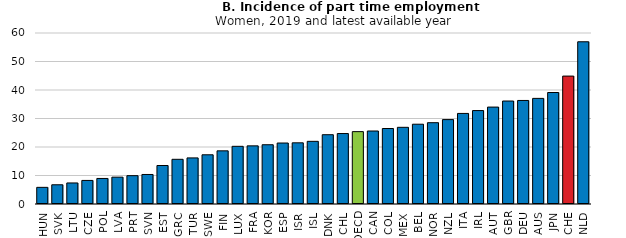
| Category | Women | Series 1 |
|---|---|---|
| HUN | 5.841 |  |
| SVK | 6.747 |  |
| LTU | 7.383 |  |
| CZE | 8.272 |  |
| POL | 8.959 |  |
| LVA | 9.424 |  |
| PRT | 9.944 |  |
| SVN | 10.361 |  |
| EST | 13.504 |  |
| GRC | 15.683 |  |
| TUR | 16.17 |  |
| SWE | 17.269 |  |
| FIN | 18.657 |  |
| LUX | 20.236 |  |
| FRA | 20.402 |  |
| KOR | 20.794 |  |
| ESP | 21.396 |  |
| ISR | 21.468 |  |
| ISL | 21.988 |  |
| DNK | 24.31 |  |
| CHL | 24.722 |  |
| OECD | 25.391 |  |
| CAN | 25.613 |  |
| COL | 26.488 |  |
| MEX | 26.905 |  |
| BEL | 27.994 |  |
| NOR | 28.53 |  |
| NZL | 29.615 |  |
| ITA | 31.777 |  |
| IRL | 32.784 |  |
| AUT | 34.007 |  |
| GBR | 36.133 |  |
| DEU | 36.33 |  |
| AUS | 37.057 |  |
| JPN | 39.12 |  |
| CHE | 44.883 |  |
| NLD | 56.921 |  |